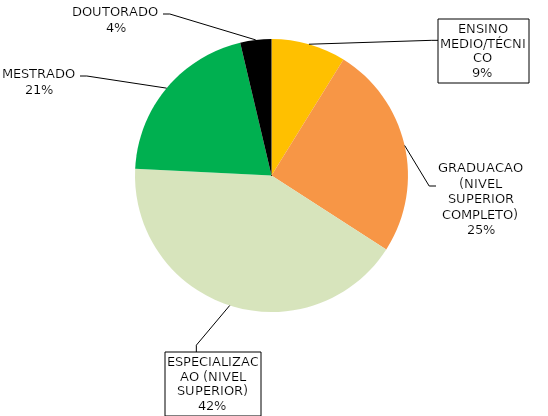
| Category | Series 0 |
|---|---|
| ENSINO MEDIO/TÉCNICO | 0.088 |
| GRADUACAO (NIVEL SUPERIOR COMPLETO) | 0.253 |
| ESPECIALIZACAO (NIVEL SUPERIOR) | 0.417 |
| MESTRADO | 0.205 |
| DOUTORADO | 0.037 |